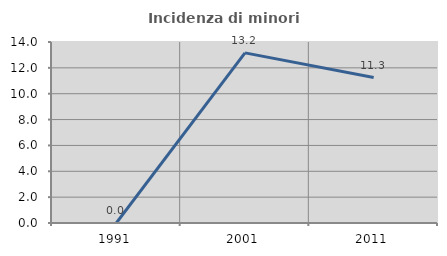
| Category | Incidenza di minori stranieri |
|---|---|
| 1991.0 | 0 |
| 2001.0 | 13.158 |
| 2011.0 | 11.25 |